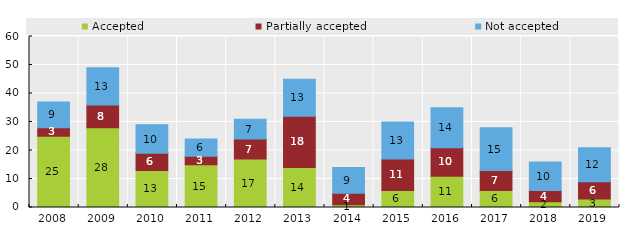
| Category | Accepted | Partially accepted | Not accepted |
|---|---|---|---|
| 2008.0 | 25 | 3 | 9 |
| 2009.0 | 28 | 8 | 13 |
| 2010.0 | 13 | 6 | 10 |
| 2011.0 | 15 | 3 | 6 |
| 2012.0 | 17 | 7 | 7 |
| 2013.0 | 14 | 18 | 13 |
| 2014.0 | 1 | 4 | 9 |
| 2015.0 | 6 | 11 | 13 |
| 2016.0 | 11 | 10 | 14 |
| 2017.0 | 6 | 7 | 15 |
| 2018.0 | 2 | 4 | 10 |
| 2019.0 | 3 | 6 | 12 |